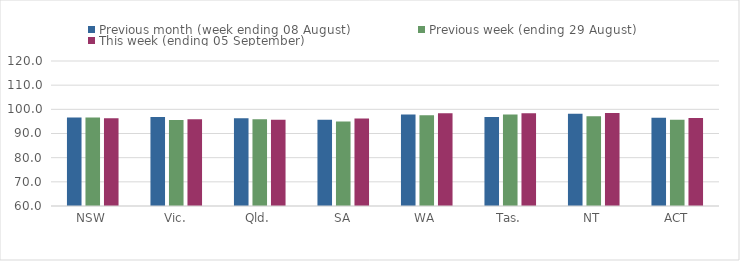
| Category | Previous month (week ending 08 August) | Previous week (ending 29 August) | This week (ending 05 September) |
|---|---|---|---|
| NSW | 96.57 | 96.61 | 96.31 |
| Vic. | 96.78 | 95.61 | 95.92 |
| Qld. | 96.28 | 95.94 | 95.69 |
| SA | 95.68 | 94.95 | 96.21 |
| WA | 97.84 | 97.58 | 98.41 |
| Tas. | 96.85 | 97.9 | 98.34 |
| NT | 98.19 | 97.13 | 98.44 |
| ACT | 96.55 | 95.69 | 96.44 |